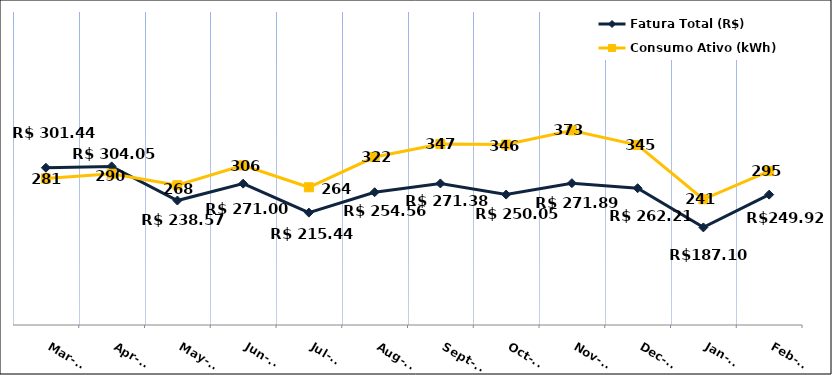
| Category | Fatura Total (R$) |
|---|---|
| 2022-03-01 | 301.44 |
| 2022-04-01 | 304.05 |
| 2022-05-01 | 238.57 |
| 2022-06-01 | 271 |
| 2022-07-01 | 215.44 |
| 2022-08-01 | 254.56 |
| 2022-09-01 | 271.38 |
| 2022-10-01 | 250.05 |
| 2022-11-01 | 271.89 |
| 2022-12-01 | 262.21 |
| 2023-01-01 | 187.1 |
| 2023-02-01 | 249.92 |